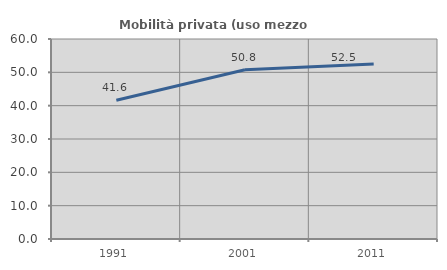
| Category | Mobilità privata (uso mezzo privato) |
|---|---|
| 1991.0 | 41.611 |
| 2001.0 | 50.772 |
| 2011.0 | 52.484 |